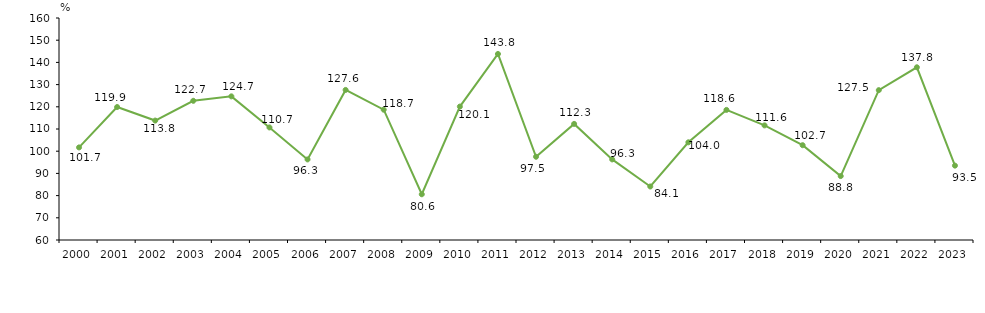
| Category | EXPORT - total |
|---|---|
| 2000.0 | 101.7 |
| 2001.0 | 119.9 |
| 2002.0 | 113.8 |
| 2003.0 | 122.7 |
| 2004.0 | 124.7 |
| 2005.0 | 110.7 |
| 2006.0 | 96.3 |
| 2007.0 | 127.6 |
| 2008.0 | 118.7 |
| 2009.0 | 80.6 |
| 2010.0 | 120.1 |
| 2011.0 | 143.8 |
| 2012.0 | 97.5 |
| 2013.0 | 112.3 |
| 2014.0 | 96.3 |
| 2015.0 | 84.1 |
| 2016.0 | 104 |
| 2017.0 | 118.6 |
| 2018.0 | 111.626 |
| 2019.0 | 102.7 |
| 2020.0 | 88.8 |
| 2021.0 | 127.5 |
| 2022.0 | 137.8 |
| 2023.0 | 93.5 |